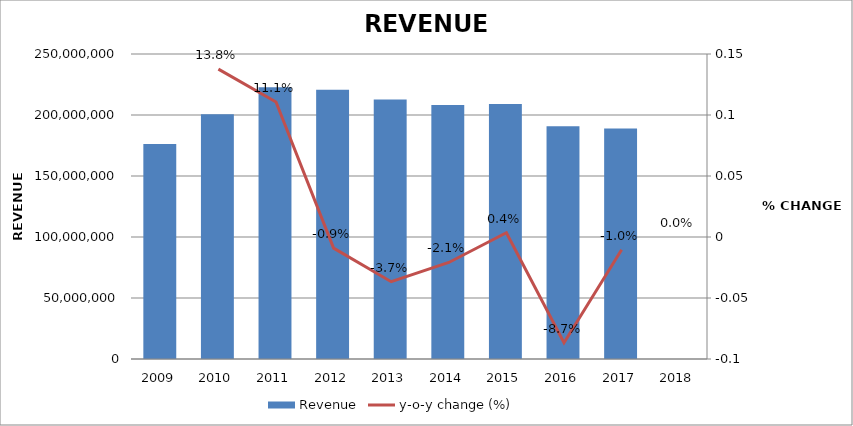
| Category | Revenue |
|---|---|
| 2009.0 | 176291985 |
| 2010.0 | 200548462 |
| 2011.0 | 222745970 |
| 2012.0 | 220713333 |
| 2013.0 | 212626773 |
| 2014.0 | 208185792 |
| 2015.0 | 208918294 |
| 2016.0 | 190818447 |
| 2017.0 | 188835828 |
| 2018.0 | 0 |